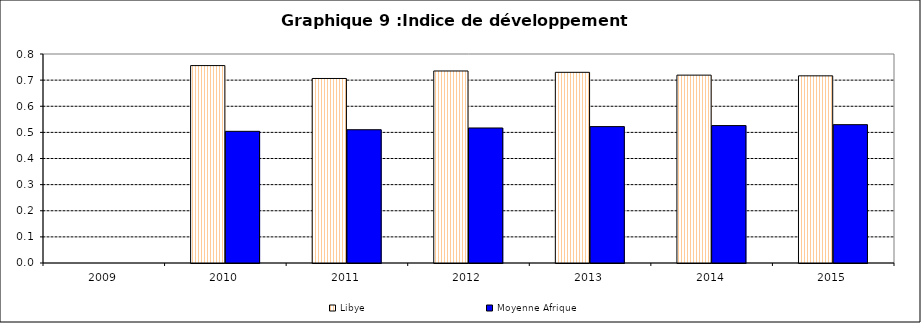
| Category | Libye | Moyenne Afrique |
|---|---|---|
| 2009.0 | 0 | 0 |
| 2010.0 | 0.756 | 0.504 |
| 2011.0 | 0.706 | 0.51 |
| 2012.0 | 0.735 | 0.517 |
| 2013.0 | 0.73 | 0.522 |
| 2014.0 | 0.719 | 0.526 |
| 2015.0 | 0.716 | 0.53 |